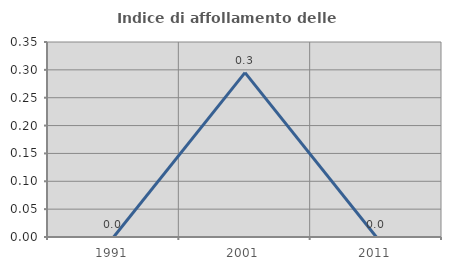
| Category | Indice di affollamento delle abitazioni  |
|---|---|
| 1991.0 | 0 |
| 2001.0 | 0.295 |
| 2011.0 | 0 |